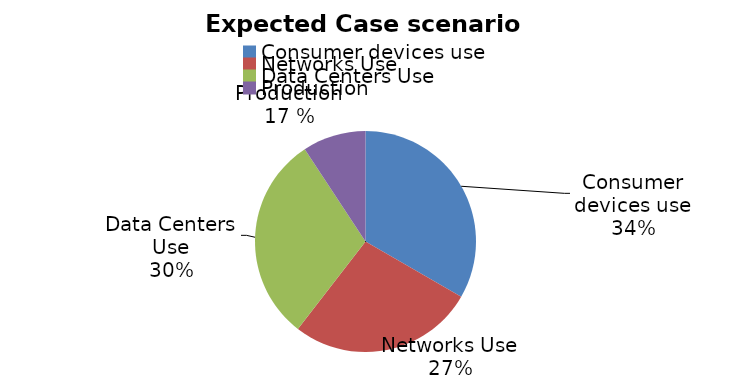
| Category | Series 0 |
|---|---|
| Consumer devices use | 1072.953 |
| Networks Use | 873.635 |
| Data Centers Use | 973.747 |
| Production | 298.038 |